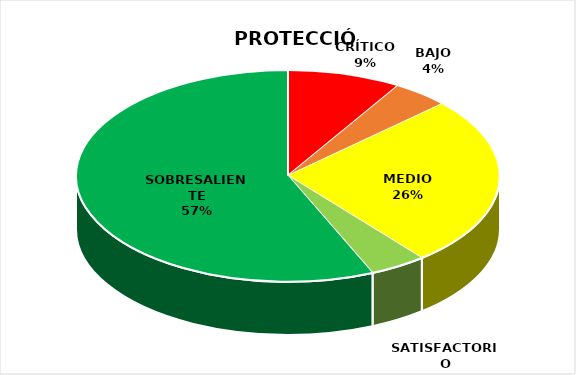
| Category | Series 0 |
|---|---|
| CRÍTICO | 2 |
| BAJO | 1 |
| MEDIO | 6 |
| SATISFACTORIO | 1 |
| SOBRESALIENTE | 13 |